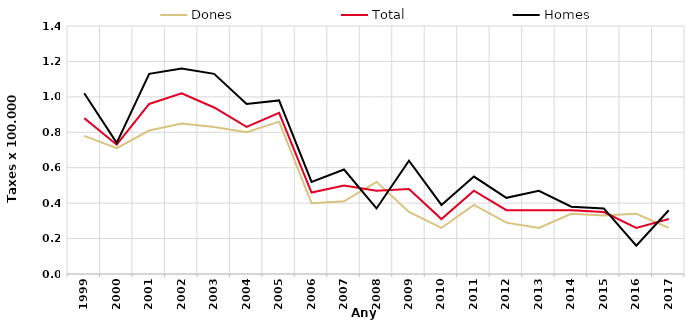
| Category | Dones | Total | Homes |
|---|---|---|---|
| 1999.0 | 0.78 | 0.88 | 1.02 |
| 2000.0 | 0.71 | 0.73 | 0.74 |
| 2001.0 | 0.81 | 0.96 | 1.13 |
| 2002.0 | 0.85 | 1.02 | 1.16 |
| 2003.0 | 0.83 | 0.94 | 1.13 |
| 2004.0 | 0.8 | 0.83 | 0.96 |
| 2005.0 | 0.86 | 0.91 | 0.98 |
| 2006.0 | 0.4 | 0.46 | 0.52 |
| 2007.0 | 0.41 | 0.5 | 0.59 |
| 2008.0 | 0.52 | 0.47 | 0.37 |
| 2009.0 | 0.35 | 0.48 | 0.64 |
| 2010.0 | 0.26 | 0.31 | 0.39 |
| 2011.0 | 0.39 | 0.47 | 0.55 |
| 2012.0 | 0.29 | 0.36 | 0.43 |
| 2013.0 | 0.26 | 0.36 | 0.47 |
| 2014.0 | 0.34 | 0.36 | 0.38 |
| 2015.0 | 0.33 | 0.35 | 0.37 |
| 2016.0 | 0.34 | 0.26 | 0.16 |
| 2017.0 | 0.26 | 0.31 | 0.36 |